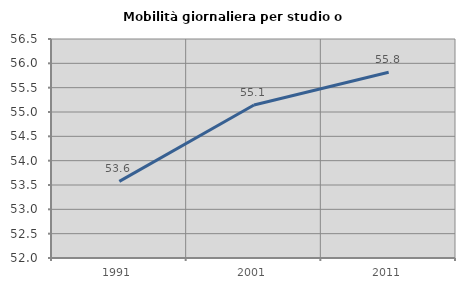
| Category | Mobilità giornaliera per studio o lavoro |
|---|---|
| 1991.0 | 53.573 |
| 2001.0 | 55.143 |
| 2011.0 | 55.815 |